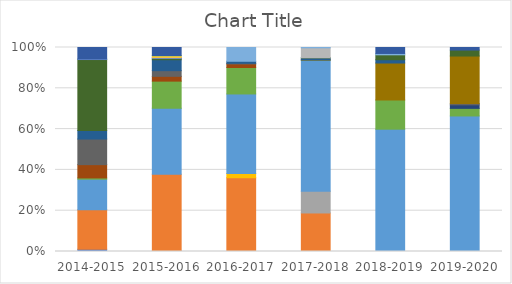
| Category | - | Clearance | Construction | Election | Event | External Initiative | Fund Cover | Human Resources | Initiative | Internal Initiative | Inventory | Marketing | Meeting | Office Supplies | Service Credit | Special Event | Transfer Out | Vendor | General Business |
|---|---|---|---|---|---|---|---|---|---|---|---|---|---|---|---|---|---|---|---|
| 2014-2015 | 399.51 | 7124.47 | 0 | 0 | 5514.15 | 226.45 | 0 | 2400 | 4614.12 | 0 | 1556.46 | 12779.62 | 113.77 | 0 | 0 | 0 | 0 | 0 | 2056 |
| 2015-2016 | 93.95 | 19055.35 | 0 | 0 | 16414.18 | 6731.96 | 0 | 1194.23 | 1403.39 | 0 | 2720.29 | 319.55 | 213 | 72 | 0 | 354.29 | 0 | 73.44 | 2000 |
| 2016-2017 | 0 | 23343.69 | 0 | 1356.98 | 25155.11 | 8379.7 | 0 | 1116 | 214.95 | 0 | 639.19 | 0 | 0 | 0 | 0 | 0 | 4356.66 | 0 | 0 |
| 2017-2018 | 0 | 14436.39 | 8171.92 | 0 | 49048.59 | 143.84 | 0 | 12.7 | 0 | 0 | 691.68 | 82.95 | 0 | 0 | 3735.53 | 0 | 121.12 | 0 | 0 |
| 2018-2019 | 0 | 0 | 0 | 0 | 51737.12 | 12355.83 | 0 | 0 | 0 | 15634.54 | 1387.82 | 2078.22 | 0 | 0 | 0 | 0 | 569.54 | 0 | 2526 |
| 2019-2020 | 0 | 0 | 0 | 0 | 9363.37 | 525.42 | 244.48 | 0 | 90.07 | 3279.82 | 0 | 411.96 | 0 | 0 | 0 | 0 | 0 | 0 | 177.99 |